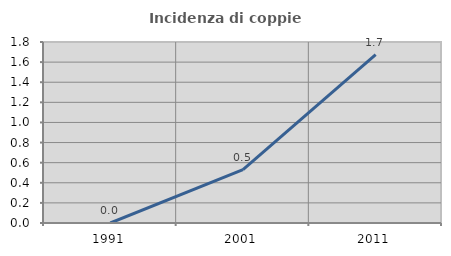
| Category | Incidenza di coppie miste |
|---|---|
| 1991.0 | 0 |
| 2001.0 | 0.53 |
| 2011.0 | 1.675 |